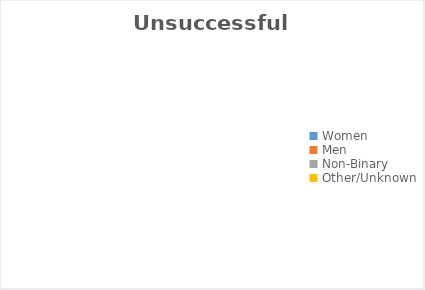
| Category | Unsuccessful Outcome |
|---|---|
| Women | 0 |
| Men | 0 |
| Non-Binary | 0 |
| Other/Unknown | 0 |